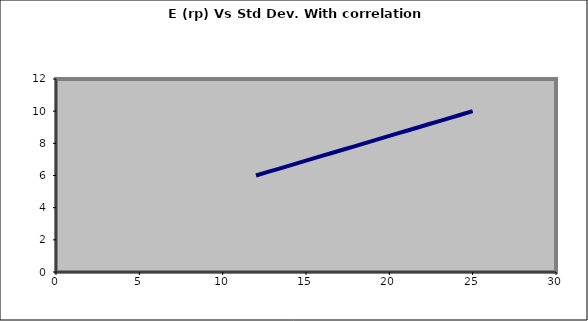
| Category | Exp Return  E(rp) % |
|---|---|
| 12.0 | 6 |
| 13.3 | 6.4 |
| 14.600000000000001 | 6.8 |
| 15.9 | 7.2 |
| 17.2 | 7.6 |
| 18.5 | 8 |
| 19.8 | 8.4 |
| 21.099999999999998 | 8.8 |
| 22.4 | 9.2 |
| 23.699999999999996 | 9.6 |
| 24.999999999999996 | 10 |